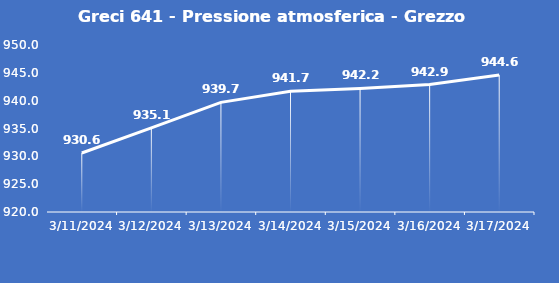
| Category | Greci 641 - Pressione atmosferica - Grezzo (hPa) |
|---|---|
| 3/11/24 | 930.6 |
| 3/12/24 | 935.1 |
| 3/13/24 | 939.7 |
| 3/14/24 | 941.7 |
| 3/15/24 | 942.2 |
| 3/16/24 | 942.9 |
| 3/17/24 | 944.6 |